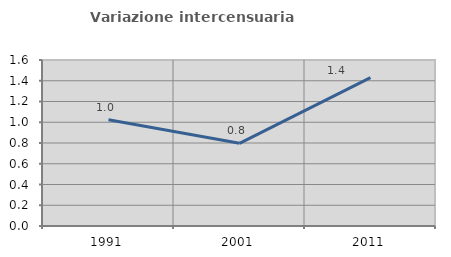
| Category | Variazione intercensuaria annua |
|---|---|
| 1991.0 | 1.024 |
| 2001.0 | 0.797 |
| 2011.0 | 1.43 |